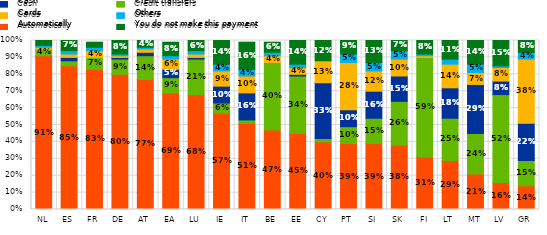
| Category | Automatically | Credit transfers  | Cash | Cards | Others | You do not make this payment  |
|---|---|---|---|---|---|---|
| NL | 0.91 | 0.04 | 0 | 0.01 | 0.01 | 0.03 |
| ES | 0.85 | 0.03 | 0.02 | 0.02 | 0.02 | 0.07 |
| FR | 0.83 | 0.07 | 0 | 0.04 | 0.02 | 0.03 |
| DE | 0.8 | 0.09 | 0.01 | 0.01 | 0.01 | 0.08 |
| AT | 0.77 | 0.14 | 0.02 | 0.02 | 0.01 | 0.04 |
| EA | 0.69 | 0.09 | 0.05 | 0.06 | 0.02 | 0.08 |
| LU | 0.68 | 0.21 | 0.01 | 0.02 | 0.02 | 0.06 |
| IE | 0.57 | 0.06 | 0.1 | 0.09 | 0.04 | 0.14 |
| IT | 0.51 | 0.02 | 0.16 | 0.1 | 0.04 | 0.16 |
| BE | 0.47 | 0.4 | 0 | 0.04 | 0.02 | 0.06 |
| EE | 0.45 | 0.34 | 0.01 | 0.04 | 0.02 | 0.14 |
| CY | 0.4 | 0.02 | 0.33 | 0.13 | 0 | 0.12 |
| PT | 0.39 | 0.1 | 0.1 | 0.28 | 0.05 | 0.09 |
| SI | 0.39 | 0.15 | 0.16 | 0.12 | 0.05 | 0.13 |
| SK | 0.38 | 0.26 | 0.15 | 0.1 | 0.05 | 0.07 |
| FI | 0.31 | 0.59 | 0 | 0.01 | 0.01 | 0.08 |
| LT | 0.29 | 0.25 | 0.18 | 0.14 | 0.03 | 0.11 |
| MT | 0.21 | 0.24 | 0.29 | 0.07 | 0.05 | 0.14 |
| LV | 0.16 | 0.52 | 0.08 | 0.08 | 0.01 | 0.15 |
| GR | 0.14 | 0.15 | 0.22 | 0.38 | 0.04 | 0.08 |